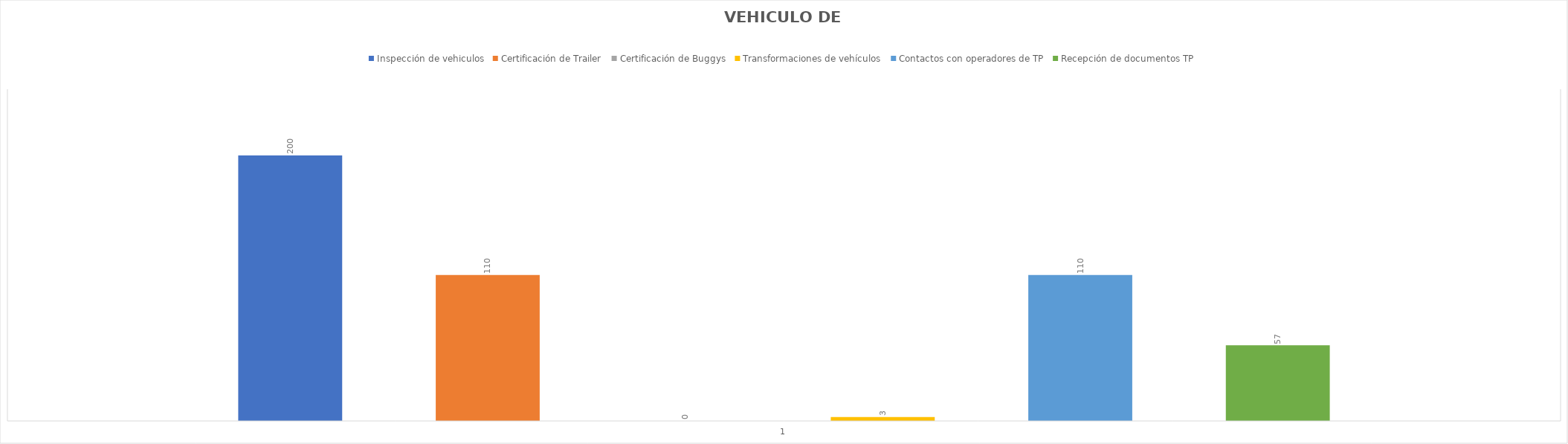
| Category | Inspección de vehiculos | Certificación de Trailer | Certificación de Buggys | Transformaciones de vehículos | Contactos con operadores de TP | Recepción de documentos TP |
|---|---|---|---|---|---|---|
| 0 | 200.127 | 110 | 0 | 3 | 110 | 57 |